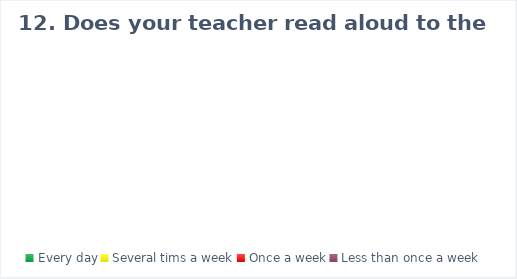
| Category | Series 0 |
|---|---|
| Every day | 0 |
| Several tims a week | 0 |
| Once a week | 0 |
| Less than once a week | 0 |